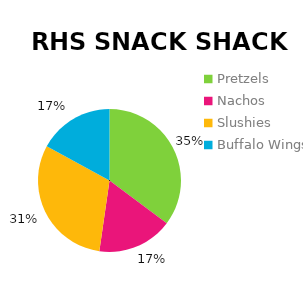
| Category | Mon | Tue  | Wed | Thu | Fri | Total |
|---|---|---|---|---|---|---|
| Pretzels  | 31 | 28 | 27 | 32 | 42 | 160 |
| Nachos | 15 | 18 | 19 | 22 | 27 | 101 |
| Slushies | 27 | 56 | 62 | 48 | 39 | 232 |
| Buffalo Wings | 15 | 13 | 18 | 21 | 18 | 85 |